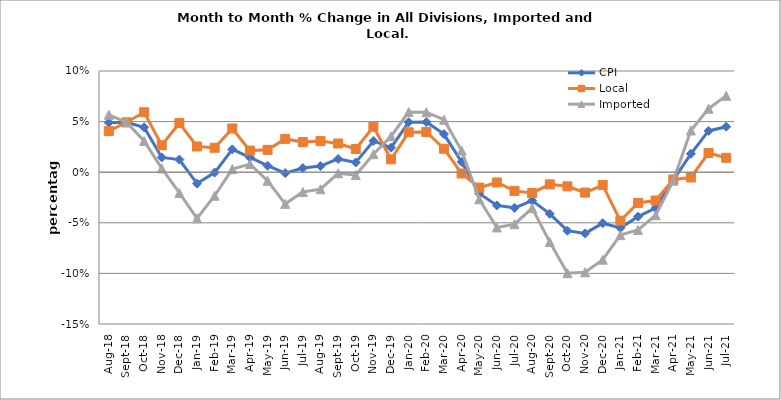
| Category | CPI | Local | Imported |
|---|---|---|---|
| 2018-08-01 | 0.049 | 0.041 | 0.057 |
| 2018-09-01 | 0.049 | 0.049 | 0.049 |
| 2018-10-01 | 0.044 | 0.059 | 0.031 |
| 2018-11-01 | 0.015 | 0.027 | 0.004 |
| 2018-12-01 | 0.012 | 0.049 | -0.021 |
| 2019-01-01 | -0.011 | 0.025 | -0.046 |
| 2019-02-01 | 0 | 0.024 | -0.023 |
| 2019-03-01 | 0.023 | 0.043 | 0.003 |
| 2019-04-01 | 0.015 | 0.021 | 0.008 |
| 2019-05-01 | 0.006 | 0.022 | -0.008 |
| 2019-06-01 | -0.001 | 0.033 | -0.031 |
| 2019-07-01 | 0.004 | 0.03 | -0.02 |
| 2019-08-01 | 0.006 | 0.031 | -0.017 |
| 2019-09-01 | 0.013 | 0.028 | -0.001 |
| 2019-10-01 | 0.01 | 0.023 | -0.003 |
| 2019-11-01 | 0.031 | 0.045 | 0.018 |
| 2019-12-01 | 0.024 | 0.013 | 0.035 |
| 2020-01-01 | 0.049 | 0.039 | 0.059 |
| 2020-02-01 | 0.05 | 0.04 | 0.059 |
| 2020-03-01 | 0.038 | 0.023 | 0.052 |
| 2020-04-01 | 0.01 | -0.001 | 0.021 |
| 2020-05-01 | -0.021 | -0.015 | -0.027 |
| 2020-06-01 | -0.033 | -0.01 | -0.055 |
| 2020-07-01 | -0.035 | -0.018 | -0.051 |
| 2020-08-01 | -0.028 | -0.02 | -0.036 |
| 2020-09-01 | -0.041 | -0.012 | -0.069 |
| 2020-10-01 | -0.058 | -0.014 | -0.1 |
| 2020-11-01 | -0.06 | -0.02 | -0.099 |
| 2020-12-01 | -0.05 | -0.013 | -0.086 |
| 2021-01-01 | -0.055 | -0.048 | -0.062 |
| 2021-02-01 | -0.044 | -0.03 | -0.057 |
| 2021-03-01 | -0.035 | -0.028 | -0.043 |
| 2021-04-01 | -0.008 | -0.007 | -0.008 |
| 2021-05-01 | 0.018 | -0.005 | 0.041 |
| 2021-06-01 | 0.041 | 0.019 | 0.063 |
| 2021-07-01 | 0.045 | 0.014 | 0.075 |